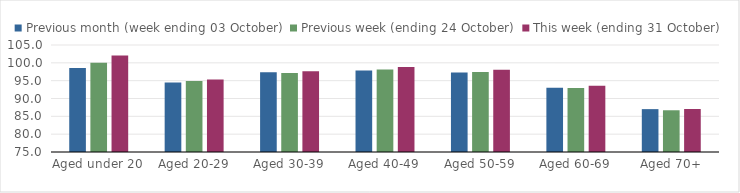
| Category | Previous month (week ending 03 October) | Previous week (ending 24 October) | This week (ending 31 October) |
|---|---|---|---|
| Aged under 20 | 98.57 | 100.01 | 102.09 |
| Aged 20-29 | 94.49 | 94.88 | 95.36 |
| Aged 30-39 | 97.34 | 97.18 | 97.61 |
| Aged 40-49 | 97.88 | 98.16 | 98.84 |
| Aged 50-59 | 97.3 | 97.4 | 98.03 |
| Aged 60-69 | 93.04 | 92.97 | 93.59 |
| Aged 70+ | 87.02 | 86.7 | 87.05 |